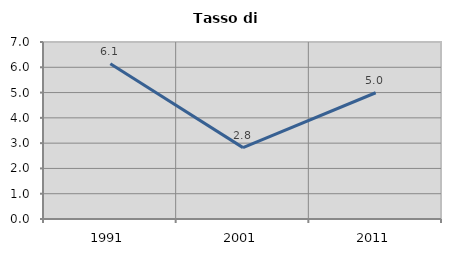
| Category | Tasso di disoccupazione   |
|---|---|
| 1991.0 | 6.137 |
| 2001.0 | 2.822 |
| 2011.0 | 4.993 |